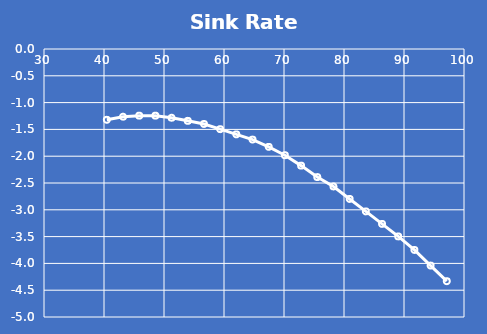
| Category | Sink Rate (kt) |
|---|---|
| 40.470886862826355 | -1.321 |
| 43.16894598701478 | -1.263 |
| 45.867005111203206 | -1.243 |
| 48.56506423539163 | -1.243 |
| 51.26312335958006 | -1.282 |
| 53.961182483768475 | -1.34 |
| 56.6592416079569 | -1.399 |
| 59.357300732145326 | -1.496 |
| 62.05535985633375 | -1.593 |
| 64.75341898052217 | -1.69 |
| 67.4514781047106 | -1.826 |
| 70.14953722889902 | -1.981 |
| 72.84759635308744 | -2.176 |
| 75.54565547727587 | -2.389 |
| 78.24371460146429 | -2.564 |
| 80.94177372565271 | -2.797 |
| 83.63983284984114 | -3.03 |
| 86.33789197402956 | -3.264 |
| 89.03595109821799 | -3.497 |
| 91.73401022240641 | -3.749 |
| 94.43206934659483 | -4.041 |
| 97.13012847078326 | -4.332 |